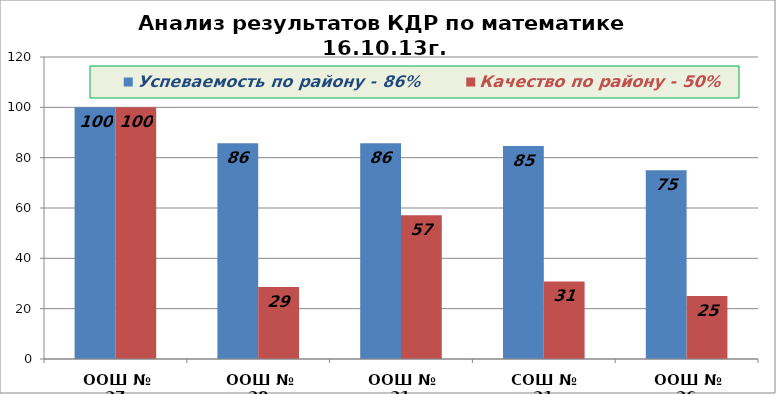
| Category | Успеваемость по району - 86% | Качество по району - 50% |
|---|---|---|
| ООШ № 27 | 100 | 100 |
| ООШ № 28 | 85.7 | 28.6 |
| ООШ № 31 | 85.7 | 57.1 |
| СОШ № 21 | 84.6 | 30.8 |
| ООШ № 26 | 75 | 25 |